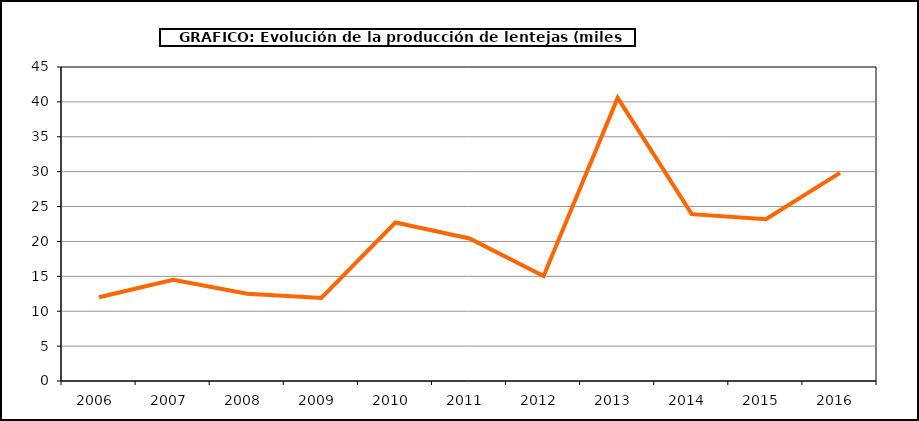
| Category | Producción |
|---|---|
| 2006.0 | 12 |
| 2007.0 | 14.496 |
| 2008.0 | 12.516 |
| 2009.0 | 11.9 |
| 2010.0 | 22.715 |
| 2011.0 | 20.426 |
| 2012.0 | 15.046 |
| 2013.0 | 40.57 |
| 2014.0 | 23.905 |
| 2015.0 | 23.193 |
| 2016.0 | 29.827 |